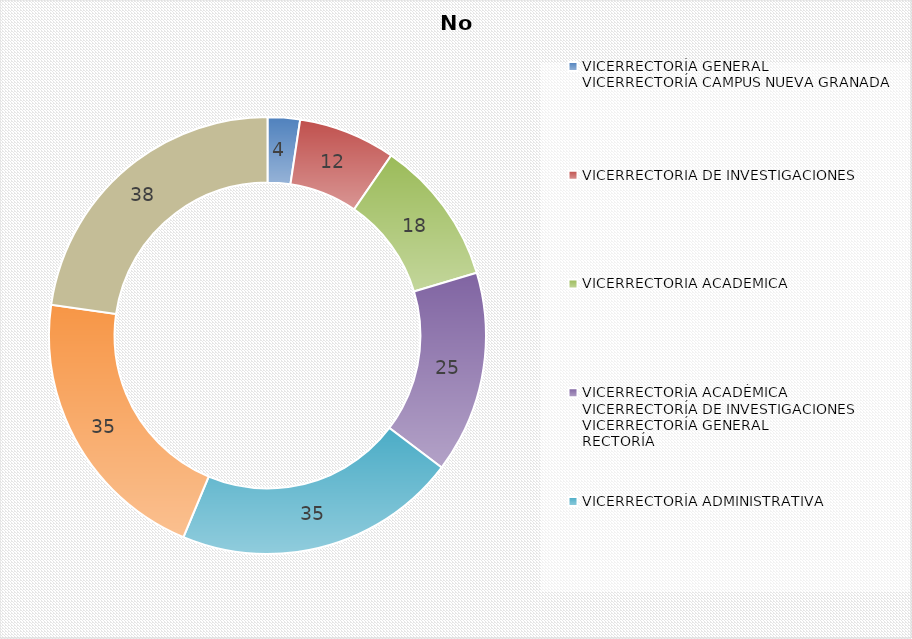
| Category | No Control |
|---|---|
| VICERRECTORÍA GENERAL
VICERRECTORÍA CAMPUS NUEVA GRANADA | 4 |
| VICERRECTORIA DE INVESTIGACIONES | 12 |
| VICERRECTORÍA ACADÉMICA | 18 |
| VICERRECTORÍA ACADÉMICA
VICERRECTORÍA DE INVESTIGACIONES
VICERRECTORÍA GENERAL
RECTORÍA


 | 25 |
| VICERRECTORÍA ADMINISTRATIVA | 35 |
| VICERRECTORÍA GENERAL | 35 |
| RECTORÍA | 38 |